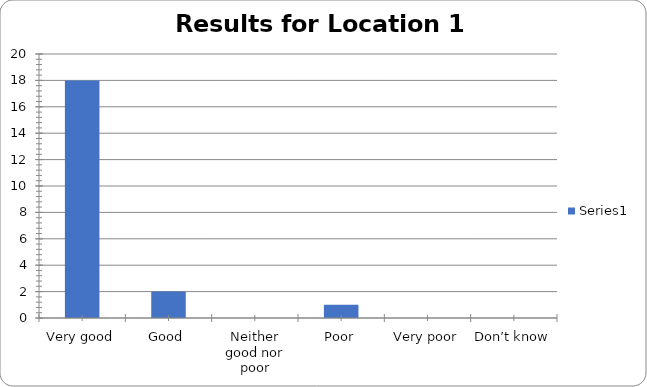
| Category | Series 0 |
|---|---|
| Very good | 18 |
| Good | 2 |
| Neither good nor poor | 0 |
| Poor | 1 |
| Very poor | 0 |
| Don’t know | 0 |